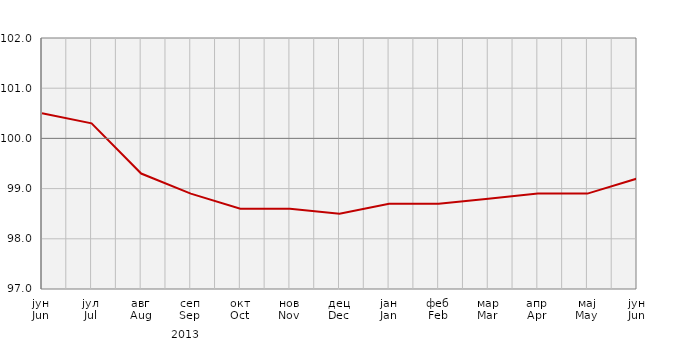
| Category | Индекси цијена произвођача
Producer price indices | Series 1 |
|---|---|---|
| јун
Jun | 100.5 |  |
| јул
Jul | 100.3 |  |
| авг
Aug | 99.3 |  |
| сеп
Sep | 98.9 |  |
| окт
Oct | 98.6 |  |
| нов
Nov | 98.6 |  |
| дец
Dec | 98.5 |  |
| јан
Jan | 98.7 |  |
| феб
Feb | 98.7 |  |
| мар
Mar | 98.8 |  |
| апр
Apr | 98.9 |  |
| мај
May | 98.9 |  |
| јун
Jun | 99.2 |  |